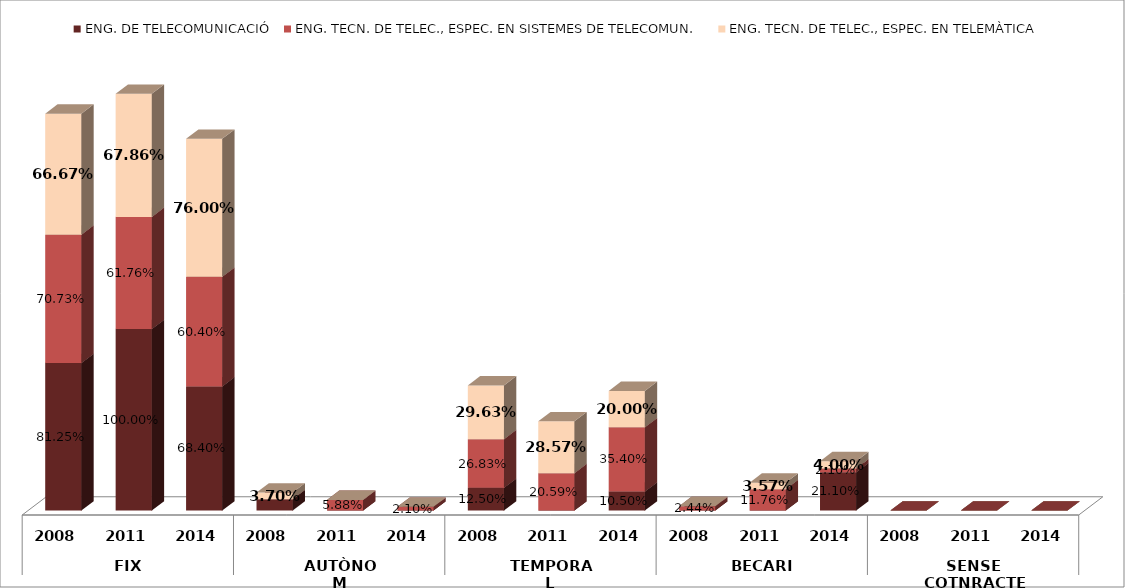
| Category | ENG. DE TELECOMUNICACIÓ | ENG. TECN. DE TELEC., ESPEC. EN SISTEMES DE TELECOMUN. | ENG. TECN. DE TELEC., ESPEC. EN TELEMÀTICA |
|---|---|---|---|
| 0 | 0.812 | 0.707 | 0.667 |
| 1 | 1 | 0.618 | 0.679 |
| 2 | 0.684 | 0.604 | 0.76 |
| 3 | 0.062 | 0 | 0.037 |
| 4 | 0 | 0.059 | 0 |
| 5 | 0 | 0.021 | 0 |
| 6 | 0.125 | 0.268 | 0.296 |
| 7 | 0 | 0.206 | 0.286 |
| 8 | 0.105 | 0.354 | 0.2 |
| 9 | 0 | 0.024 | 0 |
| 10 | 0 | 0.118 | 0.036 |
| 11 | 0.211 | 0.021 | 0.04 |
| 12 | 0 | 0 | 0 |
| 13 | 0 | 0 | 0 |
| 14 | 0 | 0 | 0 |